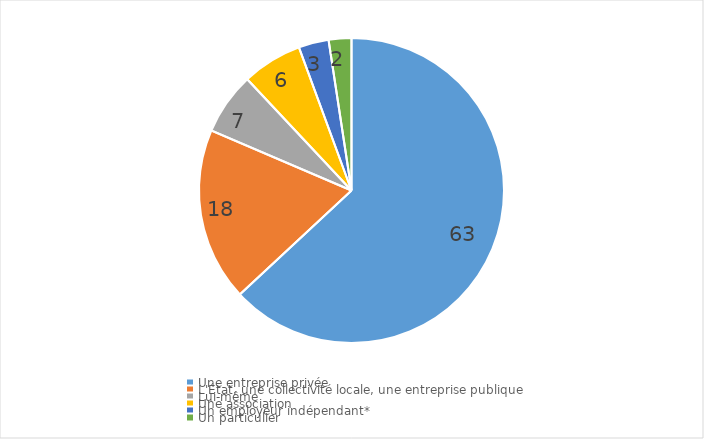
| Category | Series 0 |
|---|---|
| Une entreprise privée | 62.502 |
| L'État, une collectivité locale, une entreprise publique | 18.203 |
| Lui-même | 6.521 |
| Une association | 6.324 |
| Un employeur indépendant* | 3.164 |
| Un particulier | 2.387 |